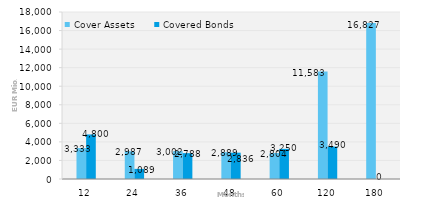
| Category | Cover Assets | Covered Bonds |
|---|---|---|
| 12.0 | 3332.919 | 4800 |
| 24.0 | 2986.601 | 1089.444 |
| 36.0 | 3001.571 | 2788 |
| 48.0 | 2888.99 | 2836.41 |
| 60.0 | 2803.575 | 3250 |
| 120.0 | 11582.879 | 3490 |
| 180.0 | 16827.109 | 0 |